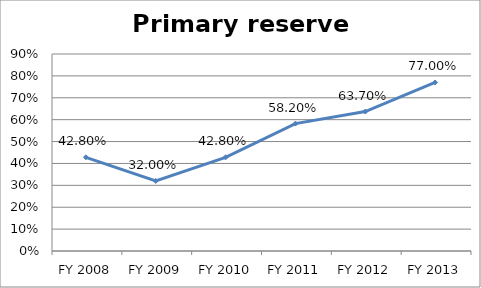
| Category | Primary reserve ratio |
|---|---|
| FY 2013 | 0.77 |
| FY 2012 | 0.637 |
| FY 2011 | 0.582 |
| FY 2010 | 0.428 |
| FY 2009 | 0.32 |
| FY 2008 | 0.428 |